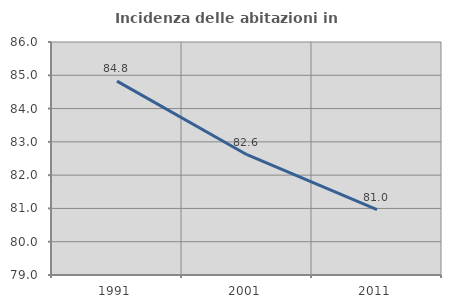
| Category | Incidenza delle abitazioni in proprietà  |
|---|---|
| 1991.0 | 84.825 |
| 2001.0 | 82.614 |
| 2011.0 | 80.962 |